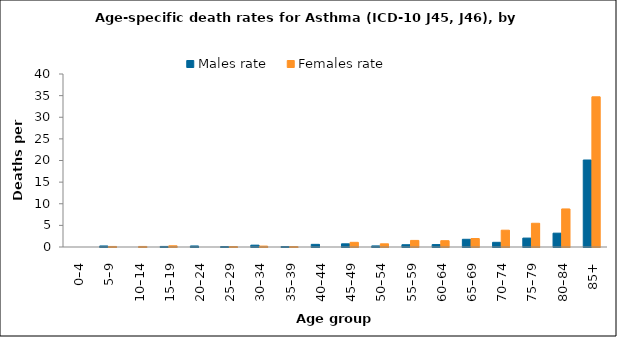
| Category | Males rate | Females rate |
|---|---|---|
| 0–4 | 0 | 0 |
| 5–9 | 0.241 | 0.127 |
| 10–14 | 0 | 0.127 |
| 15–19 | 0.131 | 0.279 |
| 20–24 | 0.239 | 0 |
| 25–29 | 0.109 | 0.111 |
| 30–34 | 0.425 | 0.209 |
| 35–39 | 0.108 | 0.106 |
| 40–44 | 0.613 | 0 |
| 45–49 | 0.734 | 1.081 |
| 50–54 | 0.252 | 0.734 |
| 55–59 | 0.525 | 1.523 |
| 60–64 | 0.562 | 1.459 |
| 65–69 | 1.781 | 1.962 |
| 70–74 | 1.082 | 3.885 |
| 75–79 | 2.063 | 5.485 |
| 80–84 | 3.2 | 8.8 |
| 85+ | 20.113 | 34.722 |